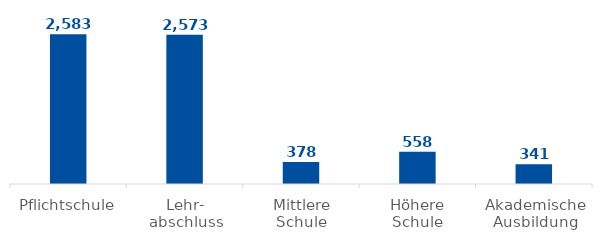
| Category | Ktn |
|---|---|
| Pflichtschule | 2583 |
| Lehr-
abschluss | 2573 |
| Mittlere
Schule | 378 |
| Höhere
Schule | 558 |
| Akademische
Ausbildung | 341 |